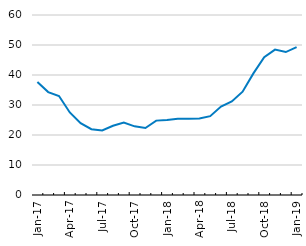
| Category | Long run inflation (y-o-y) |
|---|---|
| Jan-17 | 37.7 |
| Feb-17 | 34.3 |
| Mar-17 | 33 |
| Apr-17 | 27.519 |
| May-17 | 23.957 |
| Jun-17 | 21.928 |
| Jul-17 | 21.537 |
| Aug-17 | 23.084 |
| Sep-17 | 24.172 |
| Oct-17 | 22.887 |
| Nov-17 | 22.342 |
| Dec-17 | 24.796 |
| Jan-18 | 25.006 |
| Feb-18 | 25.437 |
| Mar-18 | 25.397 |
| Apr-18 | 25.498 |
| May-18 | 26.291 |
| Jun-18 | 29.466 |
| Jul-18 | 31.209 |
| Aug-18 | 34.426 |
| Sep-18 | 40.542 |
| Oct-18 | 45.91 |
| Nov-18 | 48.469 |
| Dec-18 | 47.646 |
| Jan-19 | 49.313 |